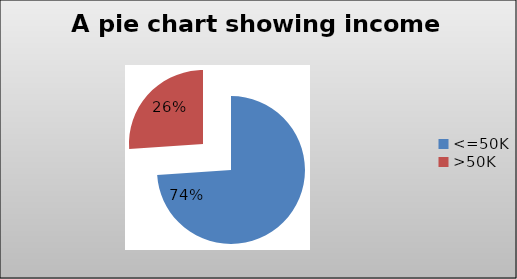
| Category | Total |
|---|---|
| <=50K | 0.739 |
| >50K | 0.261 |